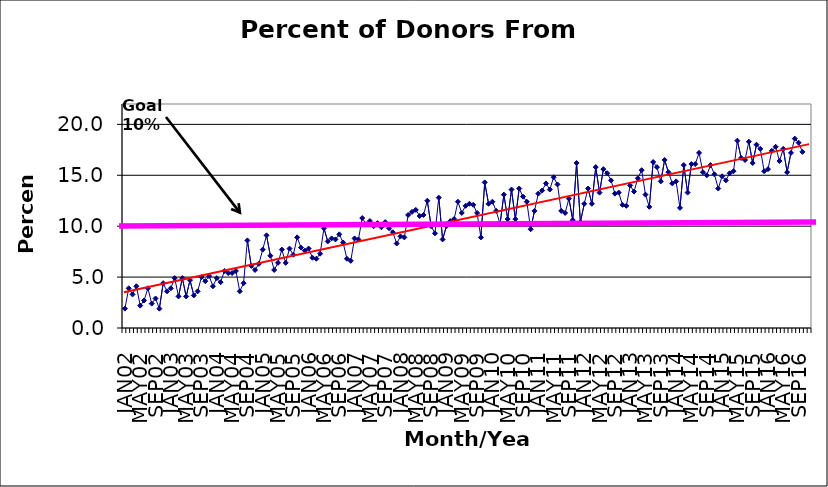
| Category | Series 0 |
|---|---|
| JAN02 | 1.9 |
| FEB02 | 3.9 |
| MAR02 | 3.3 |
| APR02 | 4.1 |
| MAY02 | 2.2 |
| JUN02 | 2.7 |
| JUL02 | 3.9 |
| AUG02 | 2.4 |
| SEP02 | 2.9 |
| OCT02 | 1.9 |
| NOV02 | 4.4 |
| DEC02 | 3.6 |
| JAN03 | 3.9 |
| FEB03 | 4.9 |
| MAR03 | 3.1 |
| APR03 | 4.9 |
| MAY03 | 3.1 |
| JUN03 | 4.7 |
| JUL03 | 3.2 |
| AUG03 | 3.6 |
| SEP03 | 5 |
| OCT03 | 4.6 |
| NOV03 | 5.1 |
| DEC03 | 4.1 |
| JAN04 | 4.9 |
| FEB04 | 4.5 |
| MAR04 | 5.6 |
| APR04 | 5.4 |
| MAY04 | 5.4 |
| JUN04 | 5.6 |
| JUL04 | 3.6 |
| AUG04 | 4.4 |
| SEP04 | 8.6 |
| OCT04 | 6.1 |
| NOV04 | 5.7 |
| DEC04 | 6.3 |
| JAN05 | 7.7 |
| FEB05 | 9.1 |
| MAR05 | 7.1 |
| APR05 | 5.7 |
| MAY05 | 6.4 |
| JUN05 | 7.7 |
| JUL05 | 6.4 |
| AUG05 | 7.8 |
| SEP05 | 7.2 |
| OCT05 | 8.9 |
| NOV05 | 7.9 |
| DEC05 | 7.6 |
| JAN06 | 7.8 |
| FEB06 | 6.9 |
| MAR06 | 6.8 |
| APR06 | 7.3 |
| MAY06 | 9.8 |
| JUN06 | 8.5 |
| JUL06 | 8.8 |
| AUG06 | 8.7 |
| SEP06 | 9.2 |
| OCT06 | 8.4 |
| NOV06 | 6.8 |
| DEC06 | 6.6 |
| JAN07 | 8.8 |
| FEB07 | 8.7 |
| MAR07 | 10.8 |
| APR07 | 10.2 |
| MAY07 | 10.5 |
| JUN07 | 10 |
| JUL07 | 10.3 |
| AUG07 | 9.9 |
| SEP07 | 10.4 |
| OCT07 | 9.8 |
| NOV07 | 9.4 |
| DEC07 | 8.3 |
| JAN08 | 9 |
| FEB08 | 8.9 |
| MAR08 | 11.1 |
| APR08 | 11.4 |
| MAY08 | 11.6 |
| JUN08 | 11 |
| JUL08 | 11.1 |
| AUG08 | 12.5 |
| SEP08 | 10 |
| OCT08 | 9.3 |
| NOV08 | 12.8 |
| DEC08 | 8.7 |
| JAN09 | 10 |
| FEB09 | 10.5 |
| MAR09 | 10.7 |
| APR09 | 12.4 |
| MAY09 | 11.3 |
| JUN09 | 12 |
| JUL09 | 12.2 |
| AUG09 | 12.1 |
| SEP09 | 11.3 |
| OCT09 | 8.9 |
| NOV09 | 14.3 |
| DEC09 | 12.2 |
| JAN10 | 12.4 |
| FEB10 | 11.5 |
| MAR10 | 10.2 |
| APR10 | 13.1 |
| MAY10 | 10.7 |
| JUN10 | 13.6 |
| JUL10 | 10.7 |
| AUG10 | 13.7 |
| SEP10 | 12.9 |
| OCT10 | 12.4 |
| NOV10 | 9.7 |
| DEC10 | 11.5 |
| JAN11 | 13.2 |
| FEB11 | 13.5 |
| MAR11 | 14.2 |
| APR11 | 13.6 |
| MAY11 | 14.8 |
| JUN11 | 14.1 |
| JUL11 | 11.5 |
| AUG11 | 11.3 |
| SEP11 | 12.7 |
| OCT11 | 10.6 |
| NOV11 | 16.2 |
| DEC11 | 10.4 |
| JAN12 | 12.2 |
| FEB12 | 13.7 |
| MAR12 | 12.2 |
| APR12 | 15.8 |
| MAY12 | 13.3 |
| JUN12 | 15.6 |
| JUL12 | 15.2 |
| AUG12 | 14.5 |
| SEP12 | 13.2 |
| OCT12 | 13.3 |
| NOV12 | 12.1 |
| DEC12 | 12 |
| JAN13 | 14 |
| FEB13 | 13.4 |
| MAR13 | 14.7 |
| APR13 | 15.5 |
| MAY13 | 13.1 |
| JUN13 | 11.9 |
| JUL13 | 16.3 |
| AUG13 | 15.8 |
| SEP13 | 14.4 |
| OCT13 | 16.5 |
| NOV13 | 15.3 |
| DEC13 | 14.2 |
| JAN14 | 14.4 |
| FEB14 | 11.8 |
| MAR14 | 16 |
| APR14 | 13.3 |
| MAY14 | 16.1 |
| JUN14 | 16.1 |
| JUL14 | 17.2 |
| AUG14 | 15.3 |
| SEP14 | 15 |
| OCT14 | 16 |
| NOV14 | 15.1 |
| DEC14 | 13.7 |
| JAN15 | 14.9 |
| FEB15 | 14.5 |
| MAR15 | 15.2 |
| APR15 | 15.4 |
| MAY15 | 18.4 |
| JUN15 | 16.7 |
| JUL15 | 16.5 |
| AUG15 | 18.3 |
| SEP15 | 16.2 |
| OCT15 | 18 |
| NOV15 | 17.6 |
| DEC15 | 15.4 |
| JAN16 | 15.6 |
| FEB16 | 17.4 |
| MAR16 | 17.8 |
| APR16 | 16.4 |
| MAY16 | 17.6 |
| JUN16 | 15.3 |
| JUL16 | 17.2 |
| AUG16 | 18.6 |
| SEP16 | 18.2 |
| OCT16 | 17.3 |